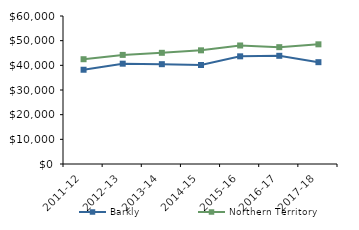
| Category | Barkly | Northern Territory |
|---|---|---|
| 2011-12 | 38211.76 | 42481 |
| 2012-13 | 40669.77 | 44232.02 |
| 2013-14 | 40468 | 45075.51 |
| 2014-15 | 40135.74 | 46083.65 |
| 2015-16 | 43653.95 | 48046.27 |
| 2016-17 | 43862.32 | 47367.05 |
| 2017-18 | 41280.66 | 48519 |